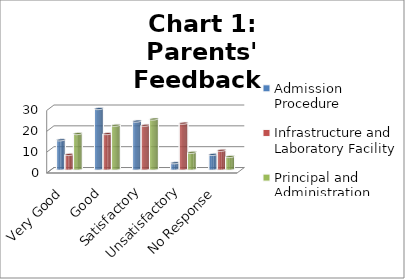
| Category | Admission Procedure | Infrastructure and Laboratory Facility | Principal and Administration |
|---|---|---|---|
| Very Good | 14 | 7 | 17 |
| Good | 29 | 17 | 21 |
| Satisfactory | 23 | 21 | 24 |
| Unsatisfactory | 3 | 22 | 8 |
| No Response | 7 | 9 | 6 |